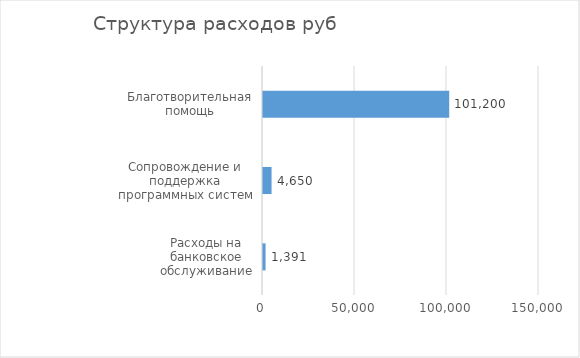
| Category | Series 0 |
|---|---|
| Расходы на банковское обслуживание | 1391 |
| Сопровождение и поддержка программных систем | 4650 |
| Благотворительная помощь | 101200 |